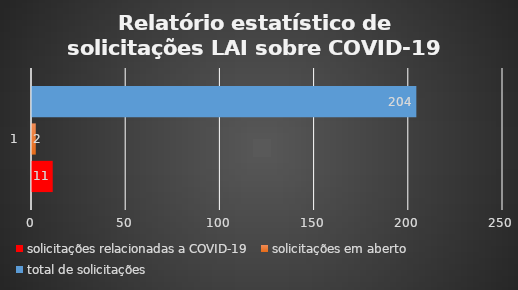
| Category | solicitações relacionadas a COVID-19 | solicitações em aberto | total de solicitações |
|---|---|---|---|
| 0 | 11 | 2 | 204 |